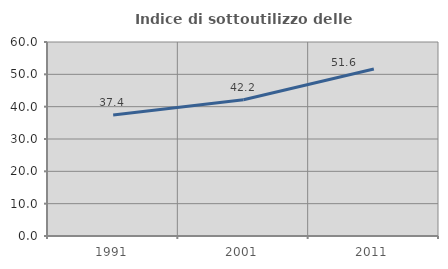
| Category | Indice di sottoutilizzo delle abitazioni  |
|---|---|
| 1991.0 | 37.432 |
| 2001.0 | 42.159 |
| 2011.0 | 51.647 |